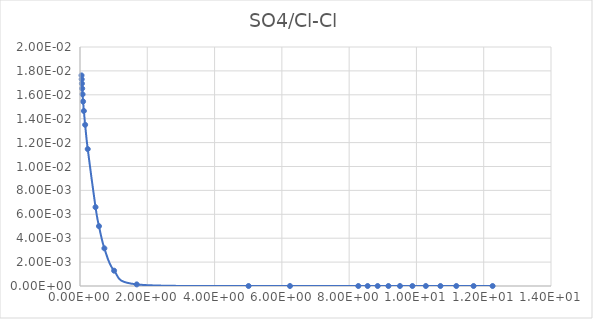
| Category | SO4/Cl |
|---|---|
| 0.045798 | 0.018 |
| 0.050886 | 0.017 |
| 0.057258 | 0.017 |
| 0.065456 | 0.017 |
| 0.076369 | 0.016 |
| 0.091683 | 0.015 |
| 0.11463 | 0.015 |
| 0.15298 | 0.013 |
| 0.2297 | 0.011 |
| 0.46159 | 0.007 |
| 0.56399 | 0.005 |
| 0.72477 | 0.003 |
| 1.0138 | 0.001 |
| 1.6863 | 0 |
| 5.0106 | 0 |
| 6.241 | 0 |
| 8.2722 | 0 |
| 8.5505 | 0 |
| 8.8482 | 0 |
| 9.1674 | 0 |
| 9.5104 | 0 |
| 9.8801 | 0 |
| 10.28 | 0 |
| 10.713 | 0 |
| 11.185 | 0 |
| 11.699 | 0 |
| 12.264 | 0 |